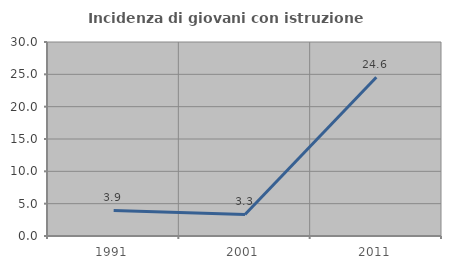
| Category | Incidenza di giovani con istruzione universitaria |
|---|---|
| 1991.0 | 3.947 |
| 2001.0 | 3.333 |
| 2011.0 | 24.561 |